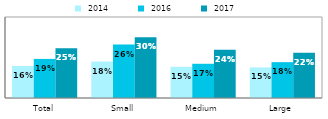
| Category |  2014 |  2016 |  2017 |
|---|---|---|---|
| Total | 0.158 | 0.193 | 0.246 |
| Small | 0.18 | 0.264 | 0.3 |
| Medium | 0.154 | 0.169 | 0.238 |
| Large | 0.151 | 0.177 | 0.224 |